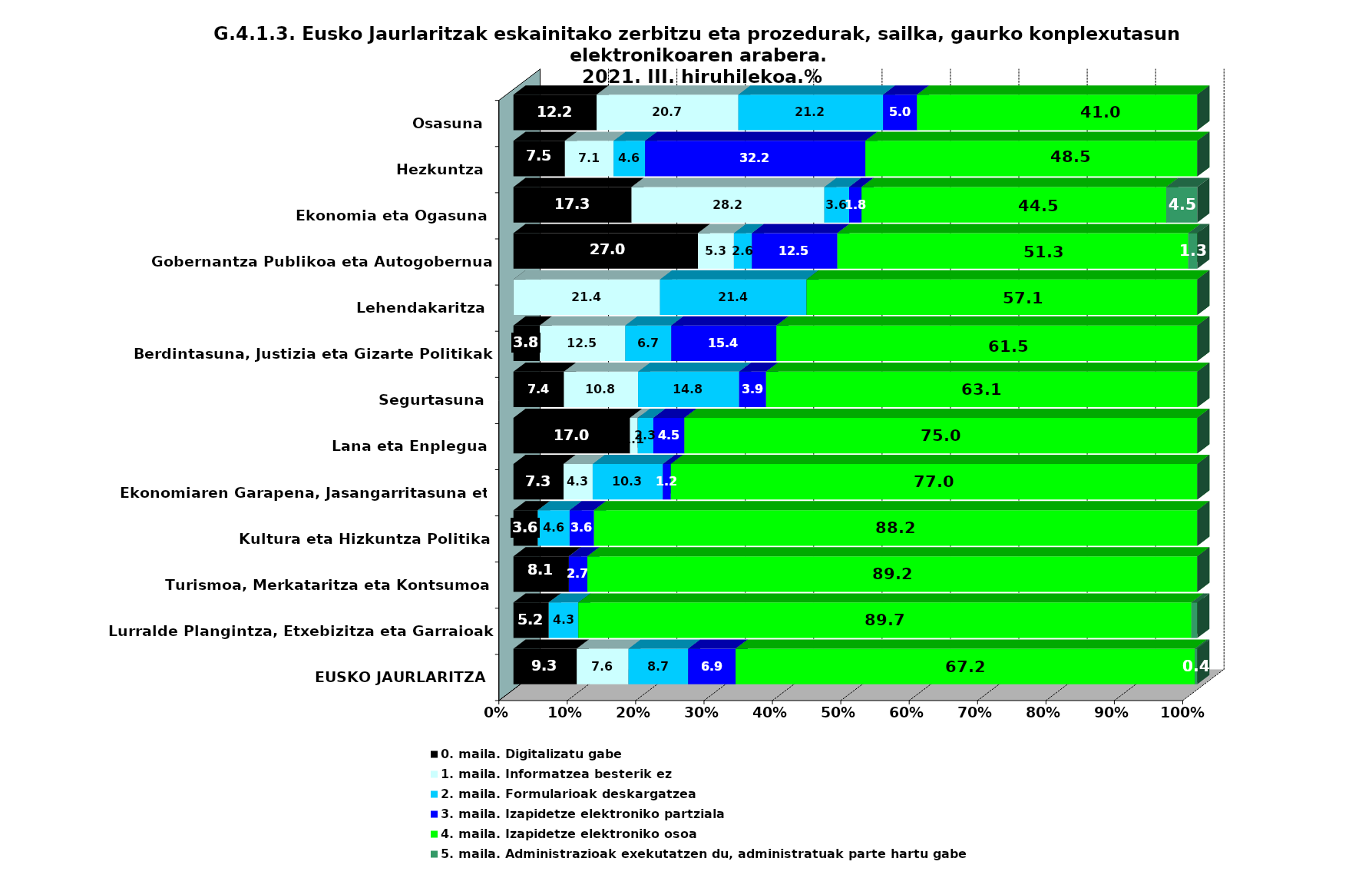
| Category | 0. maila. Digitalizatu gabe | 1. maila. Informatzea besterik ez | 2. maila. Formularioak deskargatzea | 3. maila. Izapidetze elektroniko partziala | 4. maila. Izapidetze elektroniko osoa | 5. maila. Administrazioak exekutatzen du, administratuak parte hartu gabe |
|---|---|---|---|---|---|---|
| EUSKO JAURLARITZA | 9.257 | 7.566 | 8.723 | 6.943 | 67.156 | 0.356 |
| Lurralde Plangintza, Etxebizitza eta Garraioak | 5.172 | 0 | 4.31 | 0 | 89.655 | 0.862 |
| Turismoa, Merkataritza eta Kontsumoa | 8.108 | 0 | 0 | 2.703 | 89.189 | 0 |
| Kultura eta Hizkuntza Politika | 3.571 | 0 | 4.643 | 3.571 | 88.214 | 0 |
| Ekonomiaren Garapena, Jasangarritasuna eta Ingurumena | 7.331 | 4.252 | 10.264 | 1.173 | 76.979 | 0 |
| Lana eta Enplegua | 17.045 | 1.136 | 2.273 | 4.545 | 75 | 0 |
| Segurtasuna | 7.389 | 10.837 | 14.778 | 3.941 | 63.054 | 0 |
| Berdintasuna, Justizia eta Gizarte Politikak | 3.846 | 12.5 | 6.731 | 15.385 | 61.538 | 0 |
| Lehendakaritza | 0 | 21.429 | 21.429 | 0 | 57.143 | 0 |
| Gobernantza Publikoa eta Autogobernua | 26.974 | 5.263 | 2.632 | 12.5 | 51.316 | 1.316 |
| Ekonomia eta Ogasuna | 17.273 | 28.182 | 3.636 | 1.818 | 44.545 | 4.545 |
| Hezkuntza | 7.531 | 7.113 | 4.603 | 32.218 | 48.536 | 0 |
| Osasuna | 12.162 | 20.721 | 21.171 | 4.955 | 40.991 | 0 |